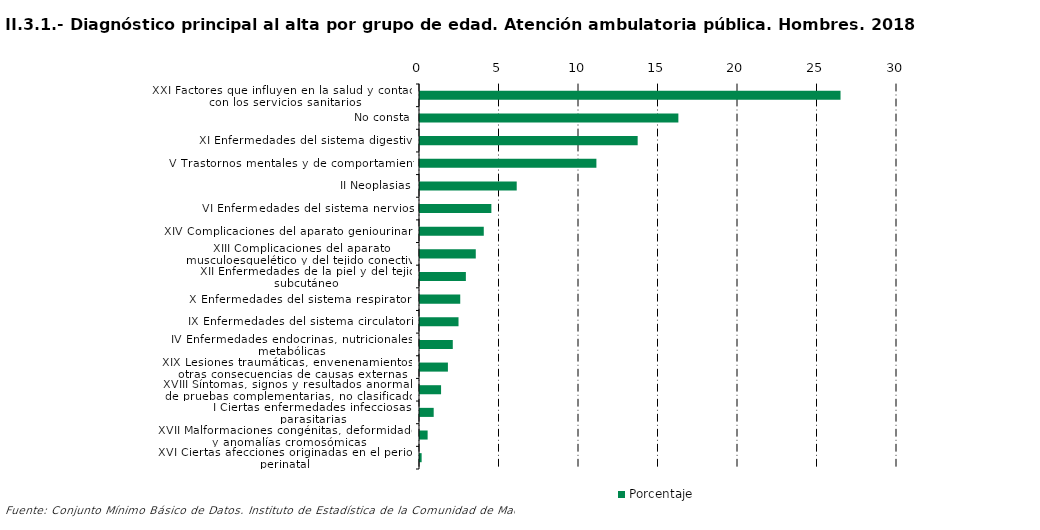
| Category | Porcentaje |
|---|---|
| XXI Factores que influyen en la salud y contacto con los servicios sanitarios | 26.448 |
| No consta | 16.25 |
| XI Enfermedades del sistema digestivo | 13.69 |
| V Trastornos mentales y de comportamiento | 11.095 |
| II Neoplasias | 6.083 |
| VI Enfermedades del sistema nervioso | 4.489 |
| XIV Complicaciones del aparato geniourinario | 4.011 |
| XIII Complicaciones del aparato musculoesquelético y del tejido conectivo | 3.508 |
| XII Enfermedades de la piel y del tejido subcutáneo | 2.885 |
| X Enfermedades del sistema respiratorio | 2.531 |
| IX Enfermedades del sistema circulatorio | 2.422 |
| IV Enfermedades endocrinas, nutricionales y metabólicas | 2.062 |
| XIX Lesiones traumáticas, envenenamientos y otras consecuencias de causas externas | 1.755 |
| XVIII Síntomas, signos y resultados anormales de pruebas complementarias, no clasificados bajo otro concepto | 1.325 |
| I Ciertas enfermedades infecciosas y parasitarias | 0.861 |
| XVII Malformaciones congénitas, deformidades y anomalías cromosómicas | 0.48 |
| XVI Ciertas afecciones originadas en el periodo perinatal | 0.102 |